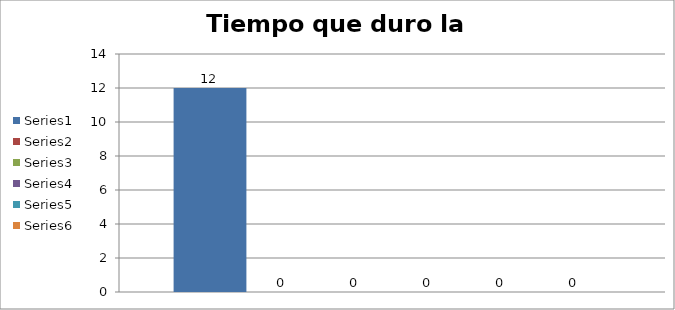
| Category | Series 0 | Series 1 | Series 2 | Series 3 | Series 4 | Series 5 |
|---|---|---|---|---|---|---|
| 0 | 12 | 0 | 0 | 0 | 0 | 0 |